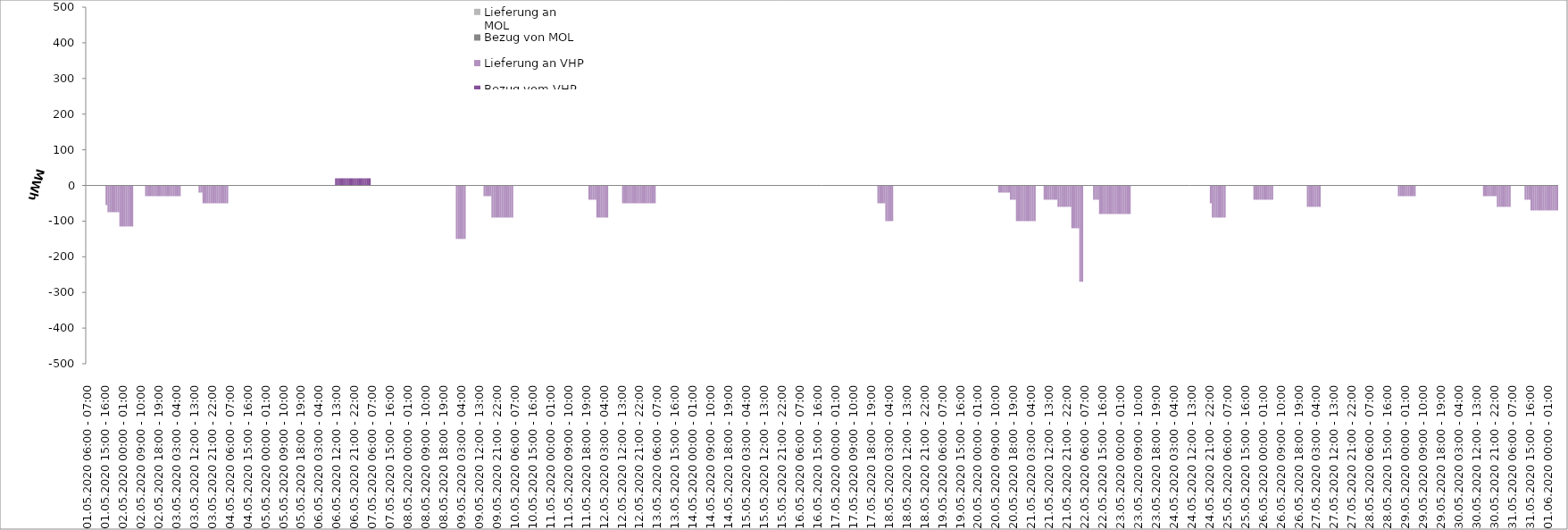
| Category | Bezug vom VHP | Lieferung an VHP | Bezug von MOL | Lieferung an MOL |
|---|---|---|---|---|
| 01.05.2020 06:00 - 07:00 | 0 | 0 | 0 | 0 |
| 01.05.2020 07:00 - 08:00 | 0 | 0 | 0 | 0 |
| 01.05.2020 08:00 - 09:00 | 0 | 0 | 0 | 0 |
| 01.05.2020 09:00 - 10:00 | 0 | 0 | 0 | 0 |
| 01.05.2020 10:00 - 11:00 | 0 | 0 | 0 | 0 |
| 01.05.2020 11:00 - 12:00 | 0 | 0 | 0 | 0 |
| 01.05.2020 12:00 - 13:00 | 0 | 0 | 0 | 0 |
| 01.05.2020 13:00 - 14:00 | 0 | 0 | 0 | 0 |
| 01.05.2020 14:00 - 15:00 | 0 | 0 | 0 | 0 |
| 01.05.2020 15:00 - 16:00 | 0 | 0 | 0 | 0 |
| 01.05.2020 16:00 - 17:00 | 0 | -55 | 0 | 0 |
| 01.05.2020 17:00 - 18:00 | 0 | -75 | 0 | 0 |
| 01.05.2020 18:00 - 19:00 | 0 | -75 | 0 | 0 |
| 01.05.2020 19:00 - 20:00 | 0 | -75 | 0 | 0 |
| 01.05.2020 20:00 - 21:00 | 0 | -75 | 0 | 0 |
| 01.05.2020 21:00 - 22:00 | 0 | -75 | 0 | 0 |
| 01.05.2020 22:00 - 23:00 | 0 | -75 | 0 | 0 |
| 01.05.2020 23:00 - 24:00 | 0 | -115 | 0 | 0 |
| 02.05.2020 00:00 - 01:00 | 0 | -115 | 0 | 0 |
| 02.05.2020 01:00 - 02:00 | 0 | -115 | 0 | 0 |
| 02.05.2020 02:00 - 03:00 | 0 | -115 | 0 | 0 |
| 02.05.2020 03:00 - 04:00 | 0 | -115 | 0 | 0 |
| 02.05.2020 04:00 - 05:00 | 0 | -115 | 0 | 0 |
| 02.05.2020 05:00 - 06:00 | 0 | -115 | 0 | 0 |
| 02.05.2020 06:00 - 07:00 | 0 | 0 | 0 | 0 |
| 02.05.2020 07:00 - 08:00 | 0 | 0 | 0 | 0 |
| 02.05.2020 08:00 - 09:00 | 0 | 0 | 0 | 0 |
| 02.05.2020 09:00 - 10:00 | 0 | 0 | 0 | 0 |
| 02.05.2020 10:00 - 11:00 | 0 | 0 | 0 | 0 |
| 02.05.2020 11:00 - 12:00 | 0 | 0 | 0 | 0 |
| 02.05.2020 12:00 - 13:00 | 0 | -30 | 0 | 0 |
| 02.05.2020 13:00 - 14:00 | 0 | -30 | 0 | 0 |
| 02.05.2020 14:00 - 15:00 | 0 | -30 | 0 | 0 |
| 02.05.2020 15:00 - 16:00 | 0 | -30 | 0 | 0 |
| 02.05.2020 16:00 - 17:00 | 0 | -30 | 0 | 0 |
| 02.05.2020 17:00 - 18:00 | 0 | -30 | 0 | 0 |
| 02.05.2020 18:00 - 19:00 | 0 | -30 | 0 | 0 |
| 02.05.2020 19:00 - 20:00 | 0 | -30 | 0 | 0 |
| 02.05.2020 20:00 - 21:00 | 0 | -30 | 0 | 0 |
| 02.05.2020 21:00 - 22:00 | 0 | -30 | 0 | 0 |
| 02.05.2020 22:00 - 23:00 | 0 | -30 | 0 | 0 |
| 02.05.2020 23:00 - 24:00 | 0 | -30 | 0 | 0 |
| 03.05.2020 00:00 - 01:00 | 0 | -30 | 0 | 0 |
| 03.05.2020 01:00 - 02:00 | 0 | -30 | 0 | 0 |
| 03.05.2020 02:00 - 03:00 | 0 | -30 | 0 | 0 |
| 03.05.2020 03:00 - 04:00 | 0 | -30 | 0 | 0 |
| 03.05.2020 04:00 - 05:00 | 0 | -30 | 0 | 0 |
| 03.05.2020 05:00 - 06:00 | 0 | -30 | 0 | 0 |
| 03.05.2020 06:00 - 07:00 | 0 | 0 | 0 | 0 |
| 03.05.2020 07:00 - 08:00 | 0 | 0 | 0 | 0 |
| 03.05.2020 08:00 - 09:00 | 0 | 0 | 0 | 0 |
| 03.05.2020 09:00 - 10:00 | 0 | 0 | 0 | 0 |
| 03.05.2020 10:00 - 11:00 | 0 | 0 | 0 | 0 |
| 03.05.2020 11:00 - 12:00 | 0 | 0 | 0 | 0 |
| 03.05.2020 12:00 - 13:00 | 0 | 0 | 0 | 0 |
| 03.05.2020 13:00 - 14:00 | 0 | 0 | 0 | 0 |
| 03.05.2020 14:00 - 15:00 | 0 | 0 | 0 | 0 |
| 03.05.2020 15:00 - 16:00 | 0 | -20 | 0 | 0 |
| 03.05.2020 16:00 - 17:00 | 0 | -20 | 0 | 0 |
| 03.05.2020 17:00 - 18:00 | 0 | -50 | 0 | 0 |
| 03.05.2020 18:00 - 19:00 | 0 | -50 | 0 | 0 |
| 03.05.2020 19:00 - 20:00 | 0 | -50 | 0 | 0 |
| 03.05.2020 20:00 - 21:00 | 0 | -50 | 0 | 0 |
| 03.05.2020 21:00 - 22:00 | 0 | -50 | 0 | 0 |
| 03.05.2020 22:00 - 23:00 | 0 | -50 | 0 | 0 |
| 03.05.2020 23:00 - 24:00 | 0 | -50 | 0 | 0 |
| 04.05.2020 00:00 - 01:00 | 0 | -50 | 0 | 0 |
| 04.05.2020 01:00 - 02:00 | 0 | -50 | 0 | 0 |
| 04.05.2020 02:00 - 03:00 | 0 | -50 | 0 | 0 |
| 04.05.2020 03:00 - 04:00 | 0 | -50 | 0 | 0 |
| 04.05.2020 04:00 - 05:00 | 0 | -50 | 0 | 0 |
| 04.05.2020 05:00 - 06:00 | 0 | -50 | 0 | 0 |
| 04.05.2020 06:00 - 07:00 | 0 | 0 | 0 | 0 |
| 04.05.2020 07:00 - 08:00 | 0 | 0 | 0 | 0 |
| 04.05.2020 08:00 - 09:00 | 0 | 0 | 0 | 0 |
| 04.05.2020 09:00 - 10:00 | 0 | 0 | 0 | 0 |
| 04.05.2020 10:00 - 11:00 | 0 | 0 | 0 | 0 |
| 04.05.2020 11:00 - 12:00 | 0 | 0 | 0 | 0 |
| 04.05.2020 12:00 - 13:00 | 0 | 0 | 0 | 0 |
| 04.05.2020 13:00 - 14:00 | 0 | 0 | 0 | 0 |
| 04.05.2020 14:00 - 15:00 | 0 | 0 | 0 | 0 |
| 04.05.2020 15:00 - 16:00 | 0 | 0 | 0 | 0 |
| 04.05.2020 16:00 - 17:00 | 0 | 0 | 0 | 0 |
| 04.05.2020 17:00 - 18:00 | 0 | 0 | 0 | 0 |
| 04.05.2020 18:00 - 19:00 | 0 | 0 | 0 | 0 |
| 04.05.2020 19:00 - 20:00 | 0 | 0 | 0 | 0 |
| 04.05.2020 20:00 - 21:00 | 0 | 0 | 0 | 0 |
| 04.05.2020 21:00 - 22:00 | 0 | 0 | 0 | 0 |
| 04.05.2020 22:00 - 23:00 | 0 | 0 | 0 | 0 |
| 04.05.2020 23:00 - 24:00 | 0 | 0 | 0 | 0 |
| 05.05.2020 00:00 - 01:00 | 0 | 0 | 0 | 0 |
| 05.05.2020 01:00 - 02:00 | 0 | 0 | 0 | 0 |
| 05.05.2020 02:00 - 03:00 | 0 | 0 | 0 | 0 |
| 05.05.2020 03:00 - 04:00 | 0 | 0 | 0 | 0 |
| 05.05.2020 04:00 - 05:00 | 0 | 0 | 0 | 0 |
| 05.05.2020 05:00 - 06:00 | 0 | 0 | 0 | 0 |
| 05.05.2020 06:00 - 07:00 | 0 | 0 | 0 | 0 |
| 05.05.2020 07:00 - 08:00 | 0 | 0 | 0 | 0 |
| 05.05.2020 08:00 - 09:00 | 0 | 0 | 0 | 0 |
| 05.05.2020 09:00 - 10:00 | 0 | 0 | 0 | 0 |
| 05.05.2020 10:00 - 11:00 | 0 | 0 | 0 | 0 |
| 05.05.2020 11:00 - 12:00 | 0 | 0 | 0 | 0 |
| 05.05.2020 12:00 - 13:00 | 0 | 0 | 0 | 0 |
| 05.05.2020 13:00 - 14:00 | 0 | 0 | 0 | 0 |
| 05.05.2020 14:00 - 15:00 | 0 | 0 | 0 | 0 |
| 05.05.2020 15:00 - 16:00 | 0 | 0 | 0 | 0 |
| 05.05.2020 16:00 - 17:00 | 0 | 0 | 0 | 0 |
| 05.05.2020 17:00 - 18:00 | 0 | 0 | 0 | 0 |
| 05.05.2020 18:00 - 19:00 | 0 | 0 | 0 | 0 |
| 05.05.2020 19:00 - 20:00 | 0 | 0 | 0 | 0 |
| 05.05.2020 20:00 - 21:00 | 0 | 0 | 0 | 0 |
| 05.05.2020 21:00 - 22:00 | 0 | 0 | 0 | 0 |
| 05.05.2020 22:00 - 23:00 | 0 | 0 | 0 | 0 |
| 05.05.2020 23:00 - 24:00 | 0 | 0 | 0 | 0 |
| 06.05.2020 00:00 - 01:00 | 0 | 0 | 0 | 0 |
| 06.05.2020 01:00 - 02:00 | 0 | 0 | 0 | 0 |
| 06.05.2020 02:00 - 03:00 | 0 | 0 | 0 | 0 |
| 06.05.2020 03:00 - 04:00 | 0 | 0 | 0 | 0 |
| 06.05.2020 04:00 - 05:00 | 0 | 0 | 0 | 0 |
| 06.05.2020 05:00 - 06:00 | 0 | 0 | 0 | 0 |
| 06.05.2020 06:00 - 07:00 | 0 | 0 | 0 | 0 |
| 06.05.2020 07:00 - 08:00 | 0 | 0 | 0 | 0 |
| 06.05.2020 08:00 - 09:00 | 0 | 0 | 0 | 0 |
| 06.05.2020 09:00 - 10:00 | 0 | 0 | 0 | 0 |
| 06.05.2020 10:00 - 11:00 | 0 | 0 | 0 | 0 |
| 06.05.2020 11:00 - 12:00 | 0 | 0 | 0 | 0 |
| 06.05.2020 12:00 - 13:00 | 20 | 0 | 0 | 0 |
| 06.05.2020 13:00 - 14:00 | 20 | 0 | 0 | 0 |
| 06.05.2020 14:00 - 15:00 | 20 | 0 | 0 | 0 |
| 06.05.2020 15:00 - 16:00 | 20 | 0 | 0 | 0 |
| 06.05.2020 16:00 - 17:00 | 20 | 0 | 0 | 0 |
| 06.05.2020 17:00 - 18:00 | 20 | 0 | 0 | 0 |
| 06.05.2020 18:00 - 19:00 | 20 | 0 | 0 | 0 |
| 06.05.2020 19:00 - 20:00 | 20 | 0 | 0 | 0 |
| 06.05.2020 20:00 - 21:00 | 20 | 0 | 0 | 0 |
| 06.05.2020 21:00 - 22:00 | 20 | 0 | 0 | 0 |
| 06.05.2020 22:00 - 23:00 | 20 | 0 | 0 | 0 |
| 06.05.2020 23:00 - 24:00 | 20 | 0 | 0 | 0 |
| 07.05.2020 00:00 - 01:00 | 20 | 0 | 0 | 0 |
| 07.05.2020 01:00 - 02:00 | 20 | 0 | 0 | 0 |
| 07.05.2020 02:00 - 03:00 | 20 | 0 | 0 | 0 |
| 07.05.2020 03:00 - 04:00 | 20 | 0 | 0 | 0 |
| 07.05.2020 04:00 - 05:00 | 20 | 0 | 0 | 0 |
| 07.05.2020 05:00 - 06:00 | 20 | 0 | 0 | 0 |
| 07.05.2020 06:00 - 07:00 | 0 | 0 | 0 | 0 |
| 07.05.2020 07:00 - 08:00 | 0 | 0 | 0 | 0 |
| 07.05.2020 08:00 - 09:00 | 0 | 0 | 0 | 0 |
| 07.05.2020 09:00 - 10:00 | 0 | 0 | 0 | 0 |
| 07.05.2020 10:00 - 11:00 | 0 | 0 | 0 | 0 |
| 07.05.2020 11:00 - 12:00 | 0 | 0 | 0 | 0 |
| 07.05.2020 12:00 - 13:00 | 0 | 0 | 0 | 0 |
| 07.05.2020 13:00 - 14:00 | 0 | 0 | 0 | 0 |
| 07.05.2020 14:00 - 15:00 | 0 | 0 | 0 | 0 |
| 07.05.2020 15:00 - 16:00 | 0 | 0 | 0 | 0 |
| 07.05.2020 16:00 - 17:00 | 0 | 0 | 0 | 0 |
| 07.05.2020 17:00 - 18:00 | 0 | 0 | 0 | 0 |
| 07.05.2020 18:00 - 19:00 | 0 | 0 | 0 | 0 |
| 07.05.2020 19:00 - 20:00 | 0 | 0 | 0 | 0 |
| 07.05.2020 20:00 - 21:00 | 0 | 0 | 0 | 0 |
| 07.05.2020 21:00 - 22:00 | 0 | 0 | 0 | 0 |
| 07.05.2020 22:00 - 23:00 | 0 | 0 | 0 | 0 |
| 07.05.2020 23:00 - 24:00 | 0 | 0 | 0 | 0 |
| 08.05.2020 00:00 - 01:00 | 0 | 0 | 0 | 0 |
| 08.05.2020 01:00 - 02:00 | 0 | 0 | 0 | 0 |
| 08.05.2020 02:00 - 03:00 | 0 | 0 | 0 | 0 |
| 08.05.2020 03:00 - 04:00 | 0 | 0 | 0 | 0 |
| 08.05.2020 04:00 - 05:00 | 0 | 0 | 0 | 0 |
| 08.05.2020 05:00 - 06:00 | 0 | 0 | 0 | 0 |
| 08.05.2020 06:00 - 07:00 | 0 | 0 | 0 | 0 |
| 08.05.2020 07:00 - 08:00 | 0 | 0 | 0 | 0 |
| 08.05.2020 08:00 - 09:00 | 0 | 0 | 0 | 0 |
| 08.05.2020 09:00 - 10:00 | 0 | 0 | 0 | 0 |
| 08.05.2020 10:00 - 11:00 | 0 | 0 | 0 | 0 |
| 08.05.2020 11:00 - 12:00 | 0 | 0 | 0 | 0 |
| 08.05.2020 12:00 - 13:00 | 0 | 0 | 0 | 0 |
| 08.05.2020 13:00 - 14:00 | 0 | 0 | 0 | 0 |
| 08.05.2020 14:00 - 15:00 | 0 | 0 | 0 | 0 |
| 08.05.2020 15:00 - 16:00 | 0 | 0 | 0 | 0 |
| 08.05.2020 16:00 - 17:00 | 0 | 0 | 0 | 0 |
| 08.05.2020 17:00 - 18:00 | 0 | 0 | 0 | 0 |
| 08.05.2020 18:00 - 19:00 | 0 | 0 | 0 | 0 |
| 08.05.2020 19:00 - 20:00 | 0 | 0 | 0 | 0 |
| 08.05.2020 20:00 - 21:00 | 0 | 0 | 0 | 0 |
| 08.05.2020 21:00 - 22:00 | 0 | 0 | 0 | 0 |
| 08.05.2020 22:00 - 23:00 | 0 | 0 | 0 | 0 |
| 08.05.2020 23:00 - 24:00 | 0 | 0 | 0 | 0 |
| 09.05.2020 00:00 - 01:00 | 0 | 0 | 0 | 0 |
| 09.05.2020 01:00 - 02:00 | 0 | -150 | 0 | 0 |
| 09.05.2020 02:00 - 03:00 | 0 | -150 | 0 | 0 |
| 09.05.2020 03:00 - 04:00 | 0 | -150 | 0 | 0 |
| 09.05.2020 04:00 - 05:00 | 0 | -150 | 0 | 0 |
| 09.05.2020 05:00 - 06:00 | 0 | -150 | 0 | 0 |
| 09.05.2020 06:00 - 07:00 | 0 | 0 | 0 | 0 |
| 09.05.2020 07:00 - 08:00 | 0 | 0 | 0 | 0 |
| 09.05.2020 08:00 - 09:00 | 0 | 0 | 0 | 0 |
| 09.05.2020 09:00 - 10:00 | 0 | 0 | 0 | 0 |
| 09.05.2020 10:00 - 11:00 | 0 | 0 | 0 | 0 |
| 09.05.2020 11:00 - 12:00 | 0 | 0 | 0 | 0 |
| 09.05.2020 12:00 - 13:00 | 0 | 0 | 0 | 0 |
| 09.05.2020 13:00 - 14:00 | 0 | 0 | 0 | 0 |
| 09.05.2020 14:00 - 15:00 | 0 | 0 | 0 | 0 |
| 09.05.2020 15:00 - 16:00 | 0 | -30 | 0 | 0 |
| 09.05.2020 16:00 - 17:00 | 0 | -30 | 0 | 0 |
| 09.05.2020 17:00 - 18:00 | 0 | -30 | 0 | 0 |
| 09.05.2020 18:00 - 19:00 | 0 | -30 | 0 | 0 |
| 09.05.2020 19:00 - 20:00 | 0 | -90 | 0 | 0 |
| 09.05.2020 20:00 - 21:00 | 0 | -90 | 0 | 0 |
| 09.05.2020 21:00 - 22:00 | 0 | -90 | 0 | 0 |
| 09.05.2020 22:00 - 23:00 | 0 | -90 | 0 | 0 |
| 09.05.2020 23:00 - 24:00 | 0 | -90 | 0 | 0 |
| 10.05.2020 00:00 - 01:00 | 0 | -90 | 0 | 0 |
| 10.05.2020 01:00 - 02:00 | 0 | -90 | 0 | 0 |
| 10.05.2020 02:00 - 03:00 | 0 | -90 | 0 | 0 |
| 10.05.2020 03:00 - 04:00 | 0 | -90 | 0 | 0 |
| 10.05.2020 04:00 - 05:00 | 0 | -90 | 0 | 0 |
| 10.05.2020 05:00 - 06:00 | 0 | -90 | 0 | 0 |
| 10.05.2020 06:00 - 07:00 | 0 | 0 | 0 | 0 |
| 10.05.2020 07:00 - 08:00 | 0 | 0 | 0 | 0 |
| 10.05.2020 08:00 - 09:00 | 0 | 0 | 0 | 0 |
| 10.05.2020 09:00 - 10:00 | 0 | 0 | 0 | 0 |
| 10.05.2020 10:00 - 11:00 | 0 | 0 | 0 | 0 |
| 10.05.2020 11:00 - 12:00 | 0 | 0 | 0 | 0 |
| 10.05.2020 12:00 - 13:00 | 0 | 0 | 0 | 0 |
| 10.05.2020 13:00 - 14:00 | 0 | 0 | 0 | 0 |
| 10.05.2020 14:00 - 15:00 | 0 | 0 | 0 | 0 |
| 10.05.2020 15:00 - 16:00 | 0 | 0 | 0 | 0 |
| 10.05.2020 16:00 - 17:00 | 0 | 0 | 0 | 0 |
| 10.05.2020 17:00 - 18:00 | 0 | 0 | 0 | 0 |
| 10.05.2020 18:00 - 19:00 | 0 | 0 | 0 | 0 |
| 10.05.2020 19:00 - 20:00 | 0 | 0 | 0 | 0 |
| 10.05.2020 20:00 - 21:00 | 0 | 0 | 0 | 0 |
| 10.05.2020 21:00 - 22:00 | 0 | 0 | 0 | 0 |
| 10.05.2020 22:00 - 23:00 | 0 | 0 | 0 | 0 |
| 10.05.2020 23:00 - 24:00 | 0 | 0 | 0 | 0 |
| 11.05.2020 00:00 - 01:00 | 0 | 0 | 0 | 0 |
| 11.05.2020 01:00 - 02:00 | 0 | 0 | 0 | 0 |
| 11.05.2020 02:00 - 03:00 | 0 | 0 | 0 | 0 |
| 11.05.2020 03:00 - 04:00 | 0 | 0 | 0 | 0 |
| 11.05.2020 04:00 - 05:00 | 0 | 0 | 0 | 0 |
| 11.05.2020 05:00 - 06:00 | 0 | 0 | 0 | 0 |
| 11.05.2020 06:00 - 07:00 | 0 | 0 | 0 | 0 |
| 11.05.2020 07:00 - 08:00 | 0 | 0 | 0 | 0 |
| 11.05.2020 08:00 - 09:00 | 0 | 0 | 0 | 0 |
| 11.05.2020 09:00 - 10:00 | 0 | 0 | 0 | 0 |
| 11.05.2020 10:00 - 11:00 | 0 | 0 | 0 | 0 |
| 11.05.2020 11:00 - 12:00 | 0 | 0 | 0 | 0 |
| 11.05.2020 12:00 - 13:00 | 0 | 0 | 0 | 0 |
| 11.05.2020 13:00 - 14:00 | 0 | 0 | 0 | 0 |
| 11.05.2020 14:00 - 15:00 | 0 | 0 | 0 | 0 |
| 11.05.2020 15:00 - 16:00 | 0 | 0 | 0 | 0 |
| 11.05.2020 16:00 - 17:00 | 0 | 0 | 0 | 0 |
| 11.05.2020 17:00 - 18:00 | 0 | 0 | 0 | 0 |
| 11.05.2020 18:00 - 19:00 | 0 | 0 | 0 | 0 |
| 11.05.2020 19:00 - 20:00 | 0 | 0 | 0 | 0 |
| 11.05.2020 20:00 - 21:00 | 0 | -40 | 0 | 0 |
| 11.05.2020 21:00 - 22:00 | 0 | -40 | 0 | 0 |
| 11.05.2020 22:00 - 23:00 | 0 | -40 | 0 | 0 |
| 11.05.2020 23:00 - 24:00 | 0 | -40 | 0 | 0 |
| 12.05.2020 00:00 - 01:00 | 0 | -90 | 0 | 0 |
| 12.05.2020 01:00 - 02:00 | 0 | -90 | 0 | 0 |
| 12.05.2020 02:00 - 03:00 | 0 | -90 | 0 | 0 |
| 12.05.2020 03:00 - 04:00 | 0 | -90 | 0 | 0 |
| 12.05.2020 04:00 - 05:00 | 0 | -90 | 0 | 0 |
| 12.05.2020 05:00 - 06:00 | 0 | -90 | 0 | 0 |
| 12.05.2020 06:00 - 07:00 | 0 | 0 | 0 | 0 |
| 12.05.2020 07:00 - 08:00 | 0 | 0 | 0 | 0 |
| 12.05.2020 08:00 - 09:00 | 0 | 0 | 0 | 0 |
| 12.05.2020 09:00 - 10:00 | 0 | 0 | 0 | 0 |
| 12.05.2020 10:00 - 11:00 | 0 | 0 | 0 | 0 |
| 12.05.2020 11:00 - 12:00 | 0 | 0 | 0 | 0 |
| 12.05.2020 12:00 - 13:00 | 0 | 0 | 0 | 0 |
| 12.05.2020 13:00 - 14:00 | 0 | -50 | 0 | 0 |
| 12.05.2020 14:00 - 15:00 | 0 | -50 | 0 | 0 |
| 12.05.2020 15:00 - 16:00 | 0 | -50 | 0 | 0 |
| 12.05.2020 16:00 - 17:00 | 0 | -50 | 0 | 0 |
| 12.05.2020 17:00 - 18:00 | 0 | -50 | 0 | 0 |
| 12.05.2020 18:00 - 19:00 | 0 | -50 | 0 | 0 |
| 12.05.2020 19:00 - 20:00 | 0 | -50 | 0 | 0 |
| 12.05.2020 20:00 - 21:00 | 0 | -50 | 0 | 0 |
| 12.05.2020 21:00 - 22:00 | 0 | -50 | 0 | 0 |
| 12.05.2020 22:00 - 23:00 | 0 | -50 | 0 | 0 |
| 12.05.2020 23:00 - 24:00 | 0 | -50 | 0 | 0 |
| 13.05.2020 00:00 - 01:00 | 0 | -50 | 0 | 0 |
| 13.05.2020 01:00 - 02:00 | 0 | -50 | 0 | 0 |
| 13.05.2020 02:00 - 03:00 | 0 | -50 | 0 | 0 |
| 13.05.2020 03:00 - 04:00 | 0 | -50 | 0 | 0 |
| 13.05.2020 04:00 - 05:00 | 0 | -50 | 0 | 0 |
| 13.05.2020 05:00 - 06:00 | 0 | -50 | 0 | 0 |
| 13.05.2020 06:00 - 07:00 | 0 | 0 | 0 | 0 |
| 13.05.2020 07:00 - 08:00 | 0 | 0 | 0 | 0 |
| 13.05.2020 08:00 - 09:00 | 0 | 0 | 0 | 0 |
| 13.05.2020 09:00 - 10:00 | 0 | 0 | 0 | 0 |
| 13.05.2020 10:00 - 11:00 | 0 | 0 | 0 | 0 |
| 13.05.2020 11:00 - 12:00 | 0 | 0 | 0 | 0 |
| 13.05.2020 12:00 - 13:00 | 0 | 0 | 0 | 0 |
| 13.05.2020 13:00 - 14:00 | 0 | 0 | 0 | 0 |
| 13.05.2020 14:00 - 15:00 | 0 | 0 | 0 | 0 |
| 13.05.2020 15:00 - 16:00 | 0 | 0 | 0 | 0 |
| 13.05.2020 16:00 - 17:00 | 0 | 0 | 0 | 0 |
| 13.05.2020 17:00 - 18:00 | 0 | 0 | 0 | 0 |
| 13.05.2020 18:00 - 19:00 | 0 | 0 | 0 | 0 |
| 13.05.2020 19:00 - 20:00 | 0 | 0 | 0 | 0 |
| 13.05.2020 20:00 - 21:00 | 0 | 0 | 0 | 0 |
| 13.05.2020 21:00 - 22:00 | 0 | 0 | 0 | 0 |
| 13.05.2020 22:00 - 23:00 | 0 | 0 | 0 | 0 |
| 13.05.2020 23:00 - 24:00 | 0 | 0 | 0 | 0 |
| 14.05.2020 00:00 - 01:00 | 0 | 0 | 0 | 0 |
| 14.05.2020 01:00 - 02:00 | 0 | 0 | 0 | 0 |
| 14.05.2020 02:00 - 03:00 | 0 | 0 | 0 | 0 |
| 14.05.2020 03:00 - 04:00 | 0 | 0 | 0 | 0 |
| 14.05.2020 04:00 - 05:00 | 0 | 0 | 0 | 0 |
| 14.05.2020 05:00 - 06:00 | 0 | 0 | 0 | 0 |
| 14.05.2020 06:00 - 07:00 | 0 | 0 | 0 | 0 |
| 14.05.2020 07:00 - 08:00 | 0 | 0 | 0 | 0 |
| 14.05.2020 08:00 - 09:00 | 0 | 0 | 0 | 0 |
| 14.05.2020 09:00 - 10:00 | 0 | 0 | 0 | 0 |
| 14.05.2020 10:00 - 11:00 | 0 | 0 | 0 | 0 |
| 14.05.2020 11:00 - 12:00 | 0 | 0 | 0 | 0 |
| 14.05.2020 12:00 - 13:00 | 0 | 0 | 0 | 0 |
| 14.05.2020 13:00 - 14:00 | 0 | 0 | 0 | 0 |
| 14.05.2020 14:00 - 15:00 | 0 | 0 | 0 | 0 |
| 14.05.2020 15:00 - 16:00 | 0 | 0 | 0 | 0 |
| 14.05.2020 16:00 - 17:00 | 0 | 0 | 0 | 0 |
| 14.05.2020 17:00 - 18:00 | 0 | 0 | 0 | 0 |
| 14.05.2020 18:00 - 19:00 | 0 | 0 | 0 | 0 |
| 14.05.2020 19:00 - 20:00 | 0 | 0 | 0 | 0 |
| 14.05.2020 20:00 - 21:00 | 0 | 0 | 0 | 0 |
| 14.05.2020 21:00 - 22:00 | 0 | 0 | 0 | 0 |
| 14.05.2020 22:00 - 23:00 | 0 | 0 | 0 | 0 |
| 14.05.2020 23:00 - 24:00 | 0 | 0 | 0 | 0 |
| 15.05.2020 00:00 - 01:00 | 0 | 0 | 0 | 0 |
| 15.05.2020 01:00 - 02:00 | 0 | 0 | 0 | 0 |
| 15.05.2020 02:00 - 03:00 | 0 | 0 | 0 | 0 |
| 15.05.2020 03:00 - 04:00 | 0 | 0 | 0 | 0 |
| 15.05.2020 04:00 - 05:00 | 0 | 0 | 0 | 0 |
| 15.05.2020 05:00 - 06:00 | 0 | 0 | 0 | 0 |
| 15.05.2020 06:00 - 07:00 | 0 | 0 | 0 | 0 |
| 15.05.2020 07:00 - 08:00 | 0 | 0 | 0 | 0 |
| 15.05.2020 08:00 - 09:00 | 0 | 0 | 0 | 0 |
| 15.05.2020 09:00 - 10:00 | 0 | 0 | 0 | 0 |
| 15.05.2020 10:00 - 11:00 | 0 | 0 | 0 | 0 |
| 15.05.2020 11:00 - 12:00 | 0 | 0 | 0 | 0 |
| 15.05.2020 12:00 - 13:00 | 0 | 0 | 0 | 0 |
| 15.05.2020 13:00 - 14:00 | 0 | 0 | 0 | 0 |
| 15.05.2020 14:00 - 15:00 | 0 | 0 | 0 | 0 |
| 15.05.2020 15:00 - 16:00 | 0 | 0 | 0 | 0 |
| 15.05.2020 16:00 - 17:00 | 0 | 0 | 0 | 0 |
| 15.05.2020 17:00 - 18:00 | 0 | 0 | 0 | 0 |
| 15.05.2020 18:00 - 19:00 | 0 | 0 | 0 | 0 |
| 15.05.2020 19:00 - 20:00 | 0 | 0 | 0 | 0 |
| 15.05.2020 20:00 - 21:00 | 0 | 0 | 0 | 0 |
| 15.05.2020 21:00 - 22:00 | 0 | 0 | 0 | 0 |
| 15.05.2020 22:00 - 23:00 | 0 | 0 | 0 | 0 |
| 15.05.2020 23:00 - 24:00 | 0 | 0 | 0 | 0 |
| 16.05.2020 00:00 - 01:00 | 0 | 0 | 0 | 0 |
| 16.05.2020 01:00 - 02:00 | 0 | 0 | 0 | 0 |
| 16.05.2020 02:00 - 03:00 | 0 | 0 | 0 | 0 |
| 16.05.2020 03:00 - 04:00 | 0 | 0 | 0 | 0 |
| 16.05.2020 04:00 - 05:00 | 0 | 0 | 0 | 0 |
| 16.05.2020 05:00 - 06:00 | 0 | 0 | 0 | 0 |
| 16.05.2020 06:00 - 07:00 | 0 | 0 | 0 | 0 |
| 16.05.2020 07:00 - 08:00 | 0 | 0 | 0 | 0 |
| 16.05.2020 08:00 - 09:00 | 0 | 0 | 0 | 0 |
| 16.05.2020 09:00 - 10:00 | 0 | 0 | 0 | 0 |
| 16.05.2020 10:00 - 11:00 | 0 | 0 | 0 | 0 |
| 16.05.2020 11:00 - 12:00 | 0 | 0 | 0 | 0 |
| 16.05.2020 12:00 - 13:00 | 0 | 0 | 0 | 0 |
| 16.05.2020 13:00 - 14:00 | 0 | 0 | 0 | 0 |
| 16.05.2020 14:00 - 15:00 | 0 | 0 | 0 | 0 |
| 16.05.2020 15:00 - 16:00 | 0 | 0 | 0 | 0 |
| 16.05.2020 16:00 - 17:00 | 0 | 0 | 0 | 0 |
| 16.05.2020 17:00 - 18:00 | 0 | 0 | 0 | 0 |
| 16.05.2020 18:00 - 19:00 | 0 | 0 | 0 | 0 |
| 16.05.2020 19:00 - 20:00 | 0 | 0 | 0 | 0 |
| 16.05.2020 20:00 - 21:00 | 0 | 0 | 0 | 0 |
| 16.05.2020 21:00 - 22:00 | 0 | 0 | 0 | 0 |
| 16.05.2020 22:00 - 23:00 | 0 | 0 | 0 | 0 |
| 16.05.2020 23:00 - 24:00 | 0 | 0 | 0 | 0 |
| 17.05.2020 00:00 - 01:00 | 0 | 0 | 0 | 0 |
| 17.05.2020 01:00 - 02:00 | 0 | 0 | 0 | 0 |
| 17.05.2020 02:00 - 03:00 | 0 | 0 | 0 | 0 |
| 17.05.2020 03:00 - 04:00 | 0 | 0 | 0 | 0 |
| 17.05.2020 04:00 - 05:00 | 0 | 0 | 0 | 0 |
| 17.05.2020 05:00 - 06:00 | 0 | 0 | 0 | 0 |
| 17.05.2020 06:00 - 07:00 | 0 | 0 | 0 | 0 |
| 17.05.2020 07:00 - 08:00 | 0 | 0 | 0 | 0 |
| 17.05.2020 08:00 - 09:00 | 0 | 0 | 0 | 0 |
| 17.05.2020 09:00 - 10:00 | 0 | 0 | 0 | 0 |
| 17.05.2020 10:00 - 11:00 | 0 | 0 | 0 | 0 |
| 17.05.2020 11:00 - 12:00 | 0 | 0 | 0 | 0 |
| 17.05.2020 12:00 - 13:00 | 0 | 0 | 0 | 0 |
| 17.05.2020 13:00 - 14:00 | 0 | 0 | 0 | 0 |
| 17.05.2020 14:00 - 15:00 | 0 | 0 | 0 | 0 |
| 17.05.2020 15:00 - 16:00 | 0 | 0 | 0 | 0 |
| 17.05.2020 16:00 - 17:00 | 0 | 0 | 0 | 0 |
| 17.05.2020 17:00 - 18:00 | 0 | 0 | 0 | 0 |
| 17.05.2020 18:00 - 19:00 | 0 | 0 | 0 | 0 |
| 17.05.2020 19:00 - 20:00 | 0 | 0 | 0 | 0 |
| 17.05.2020 20:00 - 21:00 | 0 | 0 | 0 | 0 |
| 17.05.2020 21:00 - 22:00 | 0 | 0 | 0 | 0 |
| 17.05.2020 22:00 - 23:00 | 0 | -50 | 0 | 0 |
| 17.05.2020 23:00 - 24:00 | 0 | -50 | 0 | 0 |
| 18.05.2020 00:00 - 01:00 | 0 | -50 | 0 | 0 |
| 18.05.2020 01:00 - 02:00 | 0 | -50 | 0 | 0 |
| 18.05.2020 02:00 - 03:00 | 0 | -100 | 0 | 0 |
| 18.05.2020 03:00 - 04:00 | 0 | -100 | 0 | 0 |
| 18.05.2020 04:00 - 05:00 | 0 | -100 | 0 | 0 |
| 18.05.2020 05:00 - 06:00 | 0 | -100 | 0 | 0 |
| 18.05.2020 06:00 - 07:00 | 0 | 0 | 0 | 0 |
| 18.05.2020 07:00 - 08:00 | 0 | 0 | 0 | 0 |
| 18.05.2020 08:00 - 09:00 | 0 | 0 | 0 | 0 |
| 18.05.2020 09:00 - 10:00 | 0 | 0 | 0 | 0 |
| 18.05.2020 10:00 - 11:00 | 0 | 0 | 0 | 0 |
| 18.05.2020 11:00 - 12:00 | 0 | 0 | 0 | 0 |
| 18.05.2020 12:00 - 13:00 | 0 | 0 | 0 | 0 |
| 18.05.2020 13:00 - 14:00 | 0 | 0 | 0 | 0 |
| 18.05.2020 14:00 - 15:00 | 0 | 0 | 0 | 0 |
| 18.05.2020 15:00 - 16:00 | 0 | 0 | 0 | 0 |
| 18.05.2020 16:00 - 17:00 | 0 | 0 | 0 | 0 |
| 18.05.2020 17:00 - 18:00 | 0 | 0 | 0 | 0 |
| 18.05.2020 18:00 - 19:00 | 0 | 0 | 0 | 0 |
| 18.05.2020 19:00 - 20:00 | 0 | 0 | 0 | 0 |
| 18.05.2020 20:00 - 21:00 | 0 | 0 | 0 | 0 |
| 18.05.2020 21:00 - 22:00 | 0 | 0 | 0 | 0 |
| 18.05.2020 22:00 - 23:00 | 0 | 0 | 0 | 0 |
| 18.05.2020 23:00 - 24:00 | 0 | 0 | 0 | 0 |
| 19.05.2020 00:00 - 01:00 | 0 | 0 | 0 | 0 |
| 19.05.2020 01:00 - 02:00 | 0 | 0 | 0 | 0 |
| 19.05.2020 02:00 - 03:00 | 0 | 0 | 0 | 0 |
| 19.05.2020 03:00 - 04:00 | 0 | 0 | 0 | 0 |
| 19.05.2020 04:00 - 05:00 | 0 | 0 | 0 | 0 |
| 19.05.2020 05:00 - 06:00 | 0 | 0 | 0 | 0 |
| 19.05.2020 06:00 - 07:00 | 0 | 0 | 0 | 0 |
| 19.05.2020 07:00 - 08:00 | 0 | 0 | 0 | 0 |
| 19.05.2020 08:00 - 09:00 | 0 | 0 | 0 | 0 |
| 19.05.2020 09:00 - 10:00 | 0 | 0 | 0 | 0 |
| 19.05.2020 10:00 - 11:00 | 0 | 0 | 0 | 0 |
| 19.05.2020 11:00 - 12:00 | 0 | 0 | 0 | 0 |
| 19.05.2020 12:00 - 13:00 | 0 | 0 | 0 | 0 |
| 19.05.2020 13:00 - 14:00 | 0 | 0 | 0 | 0 |
| 19.05.2020 14:00 - 15:00 | 0 | 0 | 0 | 0 |
| 19.05.2020 15:00 - 16:00 | 0 | 0 | 0 | 0 |
| 19.05.2020 16:00 - 17:00 | 0 | 0 | 0 | 0 |
| 19.05.2020 17:00 - 18:00 | 0 | 0 | 0 | 0 |
| 19.05.2020 18:00 - 19:00 | 0 | 0 | 0 | 0 |
| 19.05.2020 19:00 - 20:00 | 0 | 0 | 0 | 0 |
| 19.05.2020 20:00 - 21:00 | 0 | 0 | 0 | 0 |
| 19.05.2020 21:00 - 22:00 | 0 | 0 | 0 | 0 |
| 19.05.2020 22:00 - 23:00 | 0 | 0 | 0 | 0 |
| 19.05.2020 23:00 - 24:00 | 0 | 0 | 0 | 0 |
| 20.05.2020 00:00 - 01:00 | 0 | 0 | 0 | 0 |
| 20.05.2020 01:00 - 02:00 | 0 | 0 | 0 | 0 |
| 20.05.2020 02:00 - 03:00 | 0 | 0 | 0 | 0 |
| 20.05.2020 03:00 - 04:00 | 0 | 0 | 0 | 0 |
| 20.05.2020 04:00 - 05:00 | 0 | 0 | 0 | 0 |
| 20.05.2020 05:00 - 06:00 | 0 | 0 | 0 | 0 |
| 20.05.2020 06:00 - 07:00 | 0 | 0 | 0 | 0 |
| 20.05.2020 07:00 - 08:00 | 0 | 0 | 0 | 0 |
| 20.05.2020 08:00 - 09:00 | 0 | 0 | 0 | 0 |
| 20.05.2020 09:00 - 10:00 | 0 | 0 | 0 | 0 |
| 20.05.2020 10:00 - 11:00 | 0 | 0 | 0 | 0 |
| 20.05.2020 11:00 - 12:00 | 0 | -20 | 0 | 0 |
| 20.05.2020 12:00 - 13:00 | 0 | -20 | 0 | 0 |
| 20.05.2020 13:00 - 14:00 | 0 | -20 | 0 | 0 |
| 20.05.2020 14:00 - 15:00 | 0 | -20 | 0 | 0 |
| 20.05.2020 15:00 - 16:00 | 0 | -20 | 0 | 0 |
| 20.05.2020 16:00 - 17:00 | 0 | -20 | 0 | 0 |
| 20.05.2020 17:00 - 18:00 | 0 | -40 | 0 | 0 |
| 20.05.2020 18:00 - 19:00 | 0 | -40 | 0 | 0 |
| 20.05.2020 19:00 - 20:00 | 0 | -40 | 0 | 0 |
| 20.05.2020 20:00 - 21:00 | 0 | -100 | 0 | 0 |
| 20.05.2020 21:00 - 22:00 | 0 | -100 | 0 | 0 |
| 20.05.2020 22:00 - 23:00 | 0 | -100 | 0 | 0 |
| 20.05.2020 23:00 - 24:00 | 0 | -100 | 0 | 0 |
| 21.05.2020 00:00 - 01:00 | 0 | -100 | 0 | 0 |
| 21.05.2020 01:00 - 02:00 | 0 | -100 | 0 | 0 |
| 21.05.2020 02:00 - 03:00 | 0 | -100 | 0 | 0 |
| 21.05.2020 03:00 - 04:00 | 0 | -100 | 0 | 0 |
| 21.05.2020 04:00 - 05:00 | 0 | -100 | 0 | 0 |
| 21.05.2020 05:00 - 06:00 | 0 | -100 | 0 | 0 |
| 21.05.2020 06:00 - 07:00 | 0 | 0 | 0 | 0 |
| 21.05.2020 07:00 - 08:00 | 0 | 0 | 0 | 0 |
| 21.05.2020 08:00 - 09:00 | 0 | 0 | 0 | 0 |
| 21.05.2020 09:00 - 10:00 | 0 | 0 | 0 | 0 |
| 21.05.2020 10:00 - 11:00 | 0 | -40 | 0 | 0 |
| 21.05.2020 11:00 - 12:00 | 0 | -40 | 0 | 0 |
| 21.05.2020 12:00 - 13:00 | 0 | -40 | 0 | 0 |
| 21.05.2020 13:00 - 14:00 | 0 | -40 | 0 | 0 |
| 21.05.2020 14:00 - 15:00 | 0 | -40 | 0 | 0 |
| 21.05.2020 15:00 - 16:00 | 0 | -40 | 0 | 0 |
| 21.05.2020 16:00 - 17:00 | 0 | -40 | 0 | 0 |
| 21.05.2020 17:00 - 18:00 | 0 | -60 | 0 | 0 |
| 21.05.2020 18:00 - 19:00 | 0 | -60 | 0 | 0 |
| 21.05.2020 19:00 - 20:00 | 0 | -60 | 0 | 0 |
| 21.05.2020 20:00 - 21:00 | 0 | -60 | 0 | 0 |
| 21.05.2020 21:00 - 22:00 | 0 | -60 | 0 | 0 |
| 21.05.2020 22:00 - 23:00 | 0 | -60 | 0 | 0 |
| 21.05.2020 23:00 - 24:00 | 0 | -60 | 0 | 0 |
| 22.05.2020 00:00 - 01:00 | 0 | -120 | 0 | 0 |
| 22.05.2020 01:00 - 02:00 | 0 | -120 | 0 | 0 |
| 22.05.2020 02:00 - 03:00 | 0 | -120 | 0 | 0 |
| 22.05.2020 03:00 - 04:00 | 0 | -120 | 0 | 0 |
| 22.05.2020 04:00 - 05:00 | 0 | -270 | 0 | 0 |
| 22.05.2020 05:00 - 06:00 | 0 | -270 | 0 | 0 |
| 22.05.2020 06:00 - 07:00 | 0 | 0 | 0 | 0 |
| 22.05.2020 07:00 - 08:00 | 0 | 0 | 0 | 0 |
| 22.05.2020 08:00 - 09:00 | 0 | 0 | 0 | 0 |
| 22.05.2020 09:00 - 10:00 | 0 | 0 | 0 | 0 |
| 22.05.2020 10:00 - 11:00 | 0 | 0 | 0 | 0 |
| 22.05.2020 11:00 - 12:00 | 0 | -40 | 0 | 0 |
| 22.05.2020 12:00 - 13:00 | 0 | -40 | 0 | 0 |
| 22.05.2020 13:00 - 14:00 | 0 | -40 | 0 | 0 |
| 22.05.2020 14:00 - 15:00 | 0 | -80 | 0 | 0 |
| 22.05.2020 15:00 - 16:00 | 0 | -80 | 0 | 0 |
| 22.05.2020 16:00 - 17:00 | 0 | -80 | 0 | 0 |
| 22.05.2020 17:00 - 18:00 | 0 | -80 | 0 | 0 |
| 22.05.2020 18:00 - 19:00 | 0 | -80 | 0 | 0 |
| 22.05.2020 19:00 - 20:00 | 0 | -80 | 0 | 0 |
| 22.05.2020 20:00 - 21:00 | 0 | -80 | 0 | 0 |
| 22.05.2020 21:00 - 22:00 | 0 | -80 | 0 | 0 |
| 22.05.2020 22:00 - 23:00 | 0 | -80 | 0 | 0 |
| 22.05.2020 23:00 - 24:00 | 0 | -80 | 0 | 0 |
| 23.05.2020 00:00 - 01:00 | 0 | -80 | 0 | 0 |
| 23.05.2020 01:00 - 02:00 | 0 | -80 | 0 | 0 |
| 23.05.2020 02:00 - 03:00 | 0 | -80 | 0 | 0 |
| 23.05.2020 03:00 - 04:00 | 0 | -80 | 0 | 0 |
| 23.05.2020 04:00 - 05:00 | 0 | -80 | 0 | 0 |
| 23.05.2020 05:00 - 06:00 | 0 | -80 | 0 | 0 |
| 23.05.2020 06:00 - 07:00 | 0 | 0 | 0 | 0 |
| 23.05.2020 07:00 - 08:00 | 0 | 0 | 0 | 0 |
| 23.05.2020 08:00 - 09:00 | 0 | 0 | 0 | 0 |
| 23.05.2020 09:00 - 10:00 | 0 | 0 | 0 | 0 |
| 23.05.2020 10:00 - 11:00 | 0 | 0 | 0 | 0 |
| 23.05.2020 11:00 - 12:00 | 0 | 0 | 0 | 0 |
| 23.05.2020 12:00 - 13:00 | 0 | 0 | 0 | 0 |
| 23.05.2020 13:00 - 14:00 | 0 | 0 | 0 | 0 |
| 23.05.2020 14:00 - 15:00 | 0 | 0 | 0 | 0 |
| 23.05.2020 15:00 - 16:00 | 0 | 0 | 0 | 0 |
| 23.05.2020 16:00 - 17:00 | 0 | 0 | 0 | 0 |
| 23.05.2020 17:00 - 18:00 | 0 | 0 | 0 | 0 |
| 23.05.2020 18:00 - 19:00 | 0 | 0 | 0 | 0 |
| 23.05.2020 19:00 - 20:00 | 0 | 0 | 0 | 0 |
| 23.05.2020 20:00 - 21:00 | 0 | 0 | 0 | 0 |
| 23.05.2020 21:00 - 22:00 | 0 | 0 | 0 | 0 |
| 23.05.2020 22:00 - 23:00 | 0 | 0 | 0 | 0 |
| 23.05.2020 23:00 - 24:00 | 0 | 0 | 0 | 0 |
| 24.05.2020 00:00 - 01:00 | 0 | 0 | 0 | 0 |
| 24.05.2020 01:00 - 02:00 | 0 | 0 | 0 | 0 |
| 24.05.2020 02:00 - 03:00 | 0 | 0 | 0 | 0 |
| 24.05.2020 03:00 - 04:00 | 0 | 0 | 0 | 0 |
| 24.05.2020 04:00 - 05:00 | 0 | 0 | 0 | 0 |
| 24.05.2020 05:00 - 06:00 | 0 | 0 | 0 | 0 |
| 24.05.2020 06:00 - 07:00 | 0 | 0 | 0 | 0 |
| 24.05.2020 07:00 - 08:00 | 0 | 0 | 0 | 0 |
| 24.05.2020 08:00 - 09:00 | 0 | 0 | 0 | 0 |
| 24.05.2020 09:00 - 10:00 | 0 | 0 | 0 | 0 |
| 24.05.2020 10:00 - 11:00 | 0 | 0 | 0 | 0 |
| 24.05.2020 11:00 - 12:00 | 0 | 0 | 0 | 0 |
| 24.05.2020 12:00 - 13:00 | 0 | 0 | 0 | 0 |
| 24.05.2020 13:00 - 14:00 | 0 | 0 | 0 | 0 |
| 24.05.2020 14:00 - 15:00 | 0 | 0 | 0 | 0 |
| 24.05.2020 15:00 - 16:00 | 0 | 0 | 0 | 0 |
| 24.05.2020 16:00 - 17:00 | 0 | 0 | 0 | 0 |
| 24.05.2020 17:00 - 18:00 | 0 | 0 | 0 | 0 |
| 24.05.2020 18:00 - 19:00 | 0 | 0 | 0 | 0 |
| 24.05.2020 19:00 - 20:00 | 0 | 0 | 0 | 0 |
| 24.05.2020 20:00 - 21:00 | 0 | 0 | 0 | 0 |
| 24.05.2020 21:00 - 22:00 | 0 | 0 | 0 | 0 |
| 24.05.2020 22:00 - 23:00 | 0 | -50 | 0 | 0 |
| 24.05.2020 23:00 - 24:00 | 0 | -90 | 0 | 0 |
| 25.05.2020 00:00 - 01:00 | 0 | -90 | 0 | 0 |
| 25.05.2020 01:00 - 02:00 | 0 | -90 | 0 | 0 |
| 25.05.2020 02:00 - 03:00 | 0 | -90 | 0 | 0 |
| 25.05.2020 03:00 - 04:00 | 0 | -90 | 0 | 0 |
| 25.05.2020 04:00 - 05:00 | 0 | -90 | 0 | 0 |
| 25.05.2020 05:00 - 06:00 | 0 | -90 | 0 | 0 |
| 25.05.2020 06:00 - 07:00 | 0 | 0 | 0 | 0 |
| 25.05.2020 07:00 - 08:00 | 0 | 0 | 0 | 0 |
| 25.05.2020 08:00 - 09:00 | 0 | 0 | 0 | 0 |
| 25.05.2020 09:00 - 10:00 | 0 | 0 | 0 | 0 |
| 25.05.2020 10:00 - 11:00 | 0 | 0 | 0 | 0 |
| 25.05.2020 11:00 - 12:00 | 0 | 0 | 0 | 0 |
| 25.05.2020 12:00 - 13:00 | 0 | 0 | 0 | 0 |
| 25.05.2020 13:00 - 14:00 | 0 | 0 | 0 | 0 |
| 25.05.2020 14:00 - 15:00 | 0 | 0 | 0 | 0 |
| 25.05.2020 15:00 - 16:00 | 0 | 0 | 0 | 0 |
| 25.05.2020 16:00 - 17:00 | 0 | 0 | 0 | 0 |
| 25.05.2020 17:00 - 18:00 | 0 | 0 | 0 | 0 |
| 25.05.2020 18:00 - 19:00 | 0 | 0 | 0 | 0 |
| 25.05.2020 19:00 - 20:00 | 0 | 0 | 0 | 0 |
| 25.05.2020 20:00 - 21:00 | 0 | -40 | 0 | 0 |
| 25.05.2020 21:00 - 22:00 | 0 | -40 | 0 | 0 |
| 25.05.2020 22:00 - 23:00 | 0 | -40 | 0 | 0 |
| 25.05.2020 23:00 - 24:00 | 0 | -40 | 0 | 0 |
| 26.05.2020 00:00 - 01:00 | 0 | -40 | 0 | 0 |
| 26.05.2020 01:00 - 02:00 | 0 | -40 | 0 | 0 |
| 26.05.2020 02:00 - 03:00 | 0 | -40 | 0 | 0 |
| 26.05.2020 03:00 - 04:00 | 0 | -40 | 0 | 0 |
| 26.05.2020 04:00 - 05:00 | 0 | -40 | 0 | 0 |
| 26.05.2020 05:00 - 06:00 | 0 | -40 | 0 | 0 |
| 26.05.2020 06:00 - 07:00 | 0 | 0 | 0 | 0 |
| 26.05.2020 07:00 - 08:00 | 0 | 0 | 0 | 0 |
| 26.05.2020 08:00 - 09:00 | 0 | 0 | 0 | 0 |
| 26.05.2020 09:00 - 10:00 | 0 | 0 | 0 | 0 |
| 26.05.2020 10:00 - 11:00 | 0 | 0 | 0 | 0 |
| 26.05.2020 11:00 - 12:00 | 0 | 0 | 0 | 0 |
| 26.05.2020 12:00 - 13:00 | 0 | 0 | 0 | 0 |
| 26.05.2020 13:00 - 14:00 | 0 | 0 | 0 | 0 |
| 26.05.2020 14:00 - 15:00 | 0 | 0 | 0 | 0 |
| 26.05.2020 15:00 - 16:00 | 0 | 0 | 0 | 0 |
| 26.05.2020 16:00 - 17:00 | 0 | 0 | 0 | 0 |
| 26.05.2020 17:00 - 18:00 | 0 | 0 | 0 | 0 |
| 26.05.2020 18:00 - 19:00 | 0 | 0 | 0 | 0 |
| 26.05.2020 19:00 - 20:00 | 0 | 0 | 0 | 0 |
| 26.05.2020 20:00 - 21:00 | 0 | 0 | 0 | 0 |
| 26.05.2020 21:00 - 22:00 | 0 | 0 | 0 | 0 |
| 26.05.2020 22:00 - 23:00 | 0 | 0 | 0 | 0 |
| 26.05.2020 23:00 - 24:00 | 0 | -60 | 0 | 0 |
| 27.05.2020 00:00 - 01:00 | 0 | -60 | 0 | 0 |
| 27.05.2020 01:00 - 02:00 | 0 | -60 | 0 | 0 |
| 27.05.2020 02:00 - 03:00 | 0 | -60 | 0 | 0 |
| 27.05.2020 03:00 - 04:00 | 0 | -60 | 0 | 0 |
| 27.05.2020 04:00 - 05:00 | 0 | -60 | 0 | 0 |
| 27.05.2020 05:00 - 06:00 | 0 | -60 | 0 | 0 |
| 27.05.2020 06:00 - 07:00 | 0 | 0 | 0 | 0 |
| 27.05.2020 07:00 - 08:00 | 0 | 0 | 0 | 0 |
| 27.05.2020 08:00 - 09:00 | 0 | 0 | 0 | 0 |
| 27.05.2020 09:00 - 10:00 | 0 | 0 | 0 | 0 |
| 27.05.2020 10:00 - 11:00 | 0 | 0 | 0 | 0 |
| 27.05.2020 11:00 - 12:00 | 0 | 0 | 0 | 0 |
| 27.05.2020 12:00 - 13:00 | 0 | 0 | 0 | 0 |
| 27.05.2020 13:00 - 14:00 | 0 | 0 | 0 | 0 |
| 27.05.2020 14:00 - 15:00 | 0 | 0 | 0 | 0 |
| 27.05.2020 15:00 - 16:00 | 0 | 0 | 0 | 0 |
| 27.05.2020 16:00 - 17:00 | 0 | 0 | 0 | 0 |
| 27.05.2020 17:00 - 18:00 | 0 | 0 | 0 | 0 |
| 27.05.2020 18:00 - 19:00 | 0 | 0 | 0 | 0 |
| 27.05.2020 19:00 - 20:00 | 0 | 0 | 0 | 0 |
| 27.05.2020 20:00 - 21:00 | 0 | 0 | 0 | 0 |
| 27.05.2020 21:00 - 22:00 | 0 | 0 | 0 | 0 |
| 27.05.2020 22:00 - 23:00 | 0 | 0 | 0 | 0 |
| 27.05.2020 23:00 - 24:00 | 0 | 0 | 0 | 0 |
| 28.05.2020 00:00 - 01:00 | 0 | 0 | 0 | 0 |
| 28.05.2020 01:00 - 02:00 | 0 | 0 | 0 | 0 |
| 28.05.2020 02:00 - 03:00 | 0 | 0 | 0 | 0 |
| 28.05.2020 03:00 - 04:00 | 0 | 0 | 0 | 0 |
| 28.05.2020 04:00 - 05:00 | 0 | 0 | 0 | 0 |
| 28.05.2020 05:00 - 06:00 | 0 | 0 | 0 | 0 |
| 28.05.2020 06:00 - 07:00 | 0 | 0 | 0 | 0 |
| 28.05.2020 07:00 - 08:00 | 0 | 0 | 0 | 0 |
| 28.05.2020 08:00 - 09:00 | 0 | 0 | 0 | 0 |
| 28.05.2020 09:00 - 10:00 | 0 | 0 | 0 | 0 |
| 28.05.2020 10:00 - 11:00 | 0 | 0 | 0 | 0 |
| 28.05.2020 11:00 - 12:00 | 0 | 0 | 0 | 0 |
| 28.05.2020 12:00 - 13:00 | 0 | 0 | 0 | 0 |
| 28.05.2020 13:00 - 14:00 | 0 | 0 | 0 | 0 |
| 28.05.2020 14:00 - 15:00 | 0 | 0 | 0 | 0 |
| 28.05.2020 15:00 - 16:00 | 0 | 0 | 0 | 0 |
| 28.05.2020 16:00 - 17:00 | 0 | 0 | 0 | 0 |
| 28.05.2020 17:00 - 18:00 | 0 | 0 | 0 | 0 |
| 28.05.2020 18:00 - 19:00 | 0 | 0 | 0 | 0 |
| 28.05.2020 19:00 - 20:00 | 0 | 0 | 0 | 0 |
| 28.05.2020 20:00 - 21:00 | 0 | 0 | 0 | 0 |
| 28.05.2020 21:00 - 22:00 | 0 | -30 | 0 | 0 |
| 28.05.2020 22:00 - 23:00 | 0 | -30 | 0 | 0 |
| 28.05.2020 23:00 - 24:00 | 0 | -30 | 0 | 0 |
| 29.05.2020 00:00 - 01:00 | 0 | -30 | 0 | 0 |
| 29.05.2020 01:00 - 02:00 | 0 | -30 | 0 | 0 |
| 29.05.2020 02:00 - 03:00 | 0 | -30 | 0 | 0 |
| 29.05.2020 03:00 - 04:00 | 0 | -30 | 0 | 0 |
| 29.05.2020 04:00 - 05:00 | 0 | -30 | 0 | 0 |
| 29.05.2020 05:00 - 06:00 | 0 | -30 | 0 | 0 |
| 29.05.2020 06:00 - 07:00 | 0 | 0 | 0 | 0 |
| 29.05.2020 07:00 - 08:00 | 0 | 0 | 0 | 0 |
| 29.05.2020 08:00 - 09:00 | 0 | 0 | 0 | 0 |
| 29.05.2020 09:00 - 10:00 | 0 | 0 | 0 | 0 |
| 29.05.2020 10:00 - 11:00 | 0 | 0 | 0 | 0 |
| 29.05.2020 11:00 - 12:00 | 0 | 0 | 0 | 0 |
| 29.05.2020 12:00 - 13:00 | 0 | 0 | 0 | 0 |
| 29.05.2020 13:00 - 14:00 | 0 | 0 | 0 | 0 |
| 29.05.2020 14:00 - 15:00 | 0 | 0 | 0 | 0 |
| 29.05.2020 15:00 - 16:00 | 0 | 0 | 0 | 0 |
| 29.05.2020 16:00 - 17:00 | 0 | 0 | 0 | 0 |
| 29.05.2020 17:00 - 18:00 | 0 | 0 | 0 | 0 |
| 29.05.2020 18:00 - 19:00 | 0 | 0 | 0 | 0 |
| 29.05.2020 19:00 - 20:00 | 0 | 0 | 0 | 0 |
| 29.05.2020 20:00 - 21:00 | 0 | 0 | 0 | 0 |
| 29.05.2020 21:00 - 22:00 | 0 | 0 | 0 | 0 |
| 29.05.2020 22:00 - 23:00 | 0 | 0 | 0 | 0 |
| 29.05.2020 23:00 - 24:00 | 0 | 0 | 0 | 0 |
| 30.05.2020 00:00 - 01:00 | 0 | 0 | 0 | 0 |
| 30.05.2020 01:00 - 02:00 | 0 | 0 | 0 | 0 |
| 30.05.2020 02:00 - 03:00 | 0 | 0 | 0 | 0 |
| 30.05.2020 03:00 - 04:00 | 0 | 0 | 0 | 0 |
| 30.05.2020 04:00 - 05:00 | 0 | 0 | 0 | 0 |
| 30.05.2020 05:00 - 06:00 | 0 | 0 | 0 | 0 |
| 30.05.2020 06:00 - 07:00 | 0 | 0 | 0 | 0 |
| 30.05.2020 07:00 - 08:00 | 0 | 0 | 0 | 0 |
| 30.05.2020 08:00 - 09:00 | 0 | 0 | 0 | 0 |
| 30.05.2020 09:00 - 10:00 | 0 | 0 | 0 | 0 |
| 30.05.2020 10:00 - 11:00 | 0 | 0 | 0 | 0 |
| 30.05.2020 11:00 - 12:00 | 0 | 0 | 0 | 0 |
| 30.05.2020 12:00 - 13:00 | 0 | 0 | 0 | 0 |
| 30.05.2020 13:00 - 14:00 | 0 | 0 | 0 | 0 |
| 30.05.2020 14:00 - 15:00 | 0 | 0 | 0 | 0 |
| 30.05.2020 15:00 - 16:00 | 0 | 0 | 0 | 0 |
| 30.05.2020 16:00 - 17:00 | 0 | -30 | 0 | 0 |
| 30.05.2020 17:00 - 18:00 | 0 | -30 | 0 | 0 |
| 30.05.2020 18:00 - 19:00 | 0 | -30 | 0 | 0 |
| 30.05.2020 19:00 - 20:00 | 0 | -30 | 0 | 0 |
| 30.05.2020 20:00 - 21:00 | 0 | -30 | 0 | 0 |
| 30.05.2020 21:00 - 22:00 | 0 | -30 | 0 | 0 |
| 30.05.2020 22:00 - 23:00 | 0 | -30 | 0 | 0 |
| 30.05.2020 23:00 - 24:00 | 0 | -60 | 0 | 0 |
| 31.05.2020 00:00 - 01:00 | 0 | -60 | 0 | 0 |
| 31.05.2020 01:00 - 02:00 | 0 | -60 | 0 | 0 |
| 31.05.2020 02:00 - 03:00 | 0 | -60 | 0 | 0 |
| 31.05.2020 03:00 - 04:00 | 0 | -60 | 0 | 0 |
| 31.05.2020 04:00 - 05:00 | 0 | -60 | 0 | 0 |
| 31.05.2020 05:00 - 06:00 | 0 | -60 | 0 | 0 |
| 31.05.2020 06:00 - 07:00 | 0 | 0 | 0 | 0 |
| 31.05.2020 07:00 - 08:00 | 0 | 0 | 0 | 0 |
| 31.05.2020 08:00 - 09:00 | 0 | 0 | 0 | 0 |
| 31.05.2020 09:00 - 10:00 | 0 | 0 | 0 | 0 |
| 31.05.2020 10:00 - 11:00 | 0 | 0 | 0 | 0 |
| 31.05.2020 11:00 - 12:00 | 0 | 0 | 0 | 0 |
| 31.05.2020 12:00 - 13:00 | 0 | 0 | 0 | 0 |
| 31.05.2020 13:00 - 14:00 | 0 | -40 | 0 | 0 |
| 31.05.2020 14:00 - 15:00 | 0 | -40 | 0 | 0 |
| 31.05.2020 15:00 - 16:00 | 0 | -40 | 0 | 0 |
| 31.05.2020 16:00 - 17:00 | 0 | -70 | 0 | 0 |
| 31.05.2020 17:00 - 18:00 | 0 | -70 | 0 | 0 |
| 31.05.2020 18:00 - 19:00 | 0 | -70 | 0 | 0 |
| 31.05.2020 19:00 - 20:00 | 0 | -70 | 0 | 0 |
| 31.05.2020 20:00 - 21:00 | 0 | -70 | 0 | 0 |
| 31.05.2020 21:00 - 22:00 | 0 | -70 | 0 | 0 |
| 31.05.2020 22:00 - 23:00 | 0 | -70 | 0 | 0 |
| 31.05.2020 23:00 - 24:00 | 0 | -70 | 0 | 0 |
| 01.06.2020 00:00 - 01:00 | 0 | -70 | 0 | 0 |
| 01.06.2020 01:00 - 02:00 | 0 | -70 | 0 | 0 |
| 01.06.2020 02:00 - 03:00 | 0 | -70 | 0 | 0 |
| 01.06.2020 03:00 - 04:00 | 0 | -70 | 0 | 0 |
| 01.06.2020 04:00 - 05:00 | 0 | -70 | 0 | 0 |
| 01.06.2020 05:00 - 06:00 | 0 | -70 | 0 | 0 |